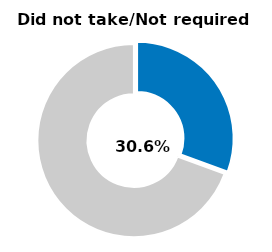
| Category | Series 0 |
|---|---|
| Did not take/not required | 0.306 |
| Other | 0.694 |